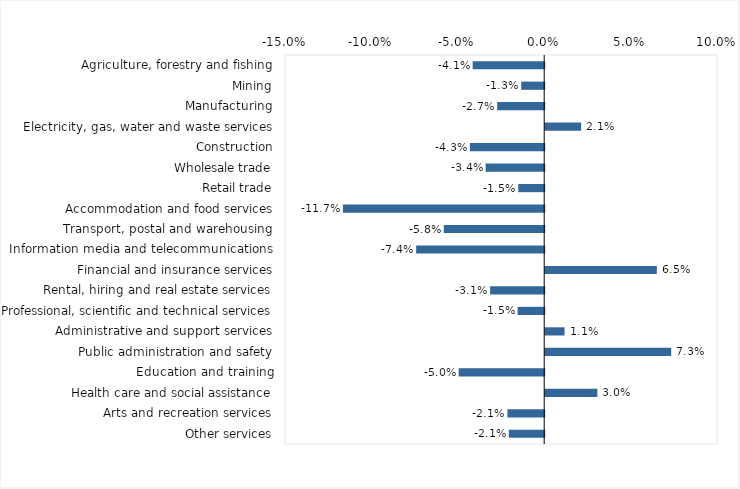
| Category | This week |
|---|---|
| Agriculture, forestry and fishing | -0.041 |
| Mining | -0.013 |
| Manufacturing | -0.027 |
| Electricity, gas, water and waste services | 0.021 |
| Construction | -0.043 |
| Wholesale trade | -0.034 |
| Retail trade | -0.015 |
| Accommodation and food services | -0.116 |
| Transport, postal and warehousing | -0.058 |
| Information media and telecommunications | -0.074 |
| Financial and insurance services | 0.065 |
| Rental, hiring and real estate services | -0.031 |
| Professional, scientific and technical services | -0.015 |
| Administrative and support services | 0.011 |
| Public administration and safety | 0.073 |
| Education and training | -0.05 |
| Health care and social assistance | 0.03 |
| Arts and recreation services | -0.021 |
| Other services | -0.02 |